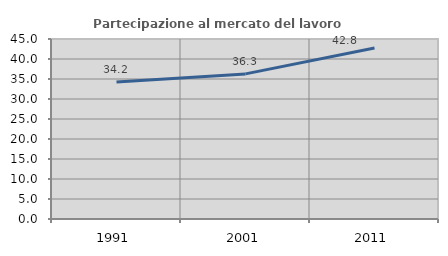
| Category | Partecipazione al mercato del lavoro  femminile |
|---|---|
| 1991.0 | 34.237 |
| 2001.0 | 36.279 |
| 2011.0 | 42.753 |